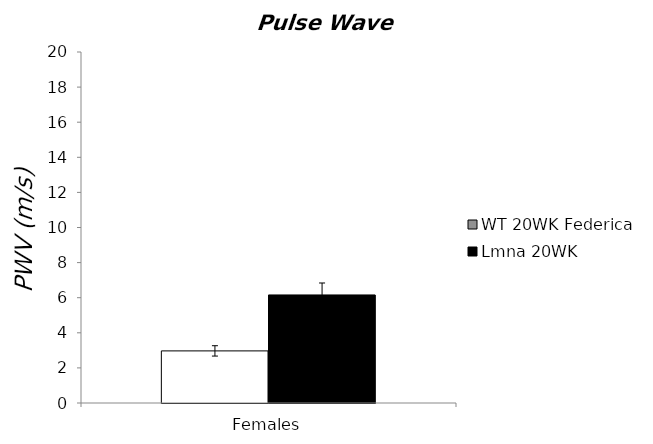
| Category | WT 20WK Federica | Lmna 20WK |
|---|---|---|
| 0 | 2.969 | 6.157 |